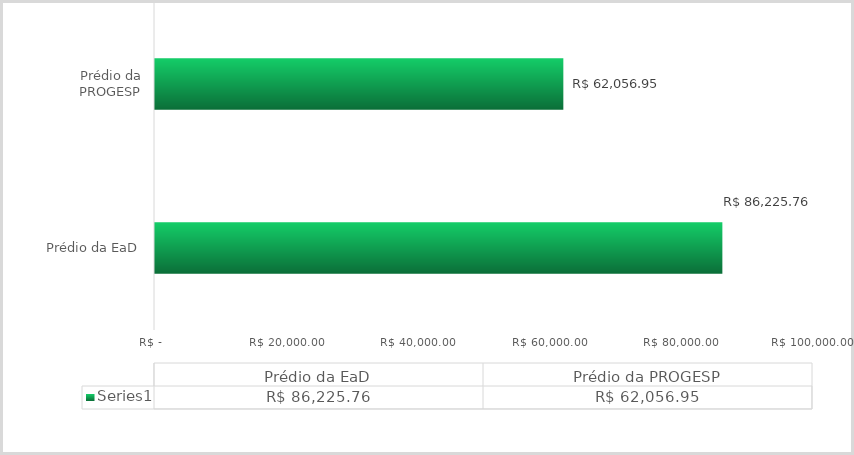
| Category | Series 0 |
|---|---|
| Prédio da EaD | 86225.76 |
| Prédio da PROGESP | 62056.95 |